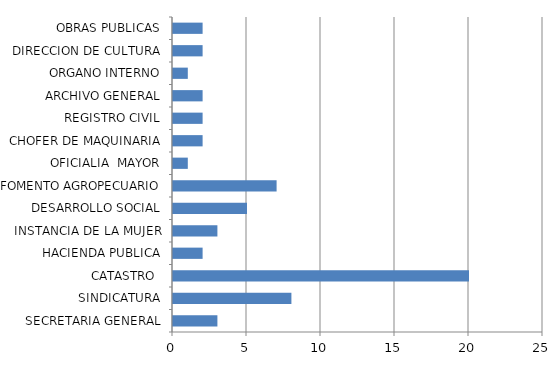
| Category | Series 0 |
|---|---|
| SECRETARIA GENERAL | 3 |
| SINDICATURA | 8 |
| CATASTRO  | 20 |
| HACIENDA PUBLICA | 2 |
| INSTANCIA DE LA MUJER | 3 |
| DESARROLLO SOCIAL | 5 |
| FOMENTO AGROPECUARIO | 7 |
| OFICIALIA  MAYOR | 1 |
| CHOFER DE MAQUINARIA | 2 |
| REGISTRO CIVIL | 2 |
| ARCHIVO GENERAL | 2 |
| ORGANO INTERNO | 1 |
| DIRECCION DE CULTURA | 2 |
| OBRAS PUBLICAS | 2 |